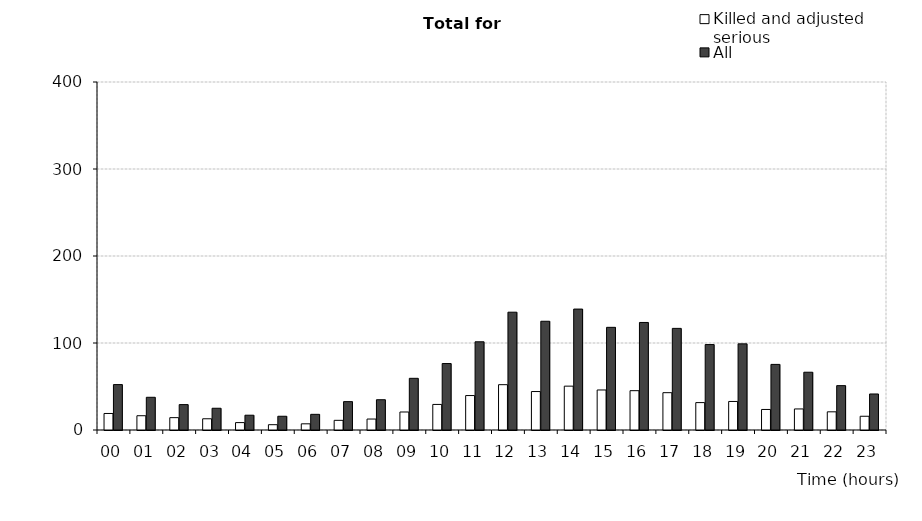
| Category | Killed and adjusted serious | All |
|---|---|---|
| 00 | 19 | 52.2 |
| 01 | 16.4 | 37.6 |
| 02 | 14.2 | 29.2 |
| 03 | 12.9 | 25 |
| 04 | 8.5 | 17 |
| 05 | 6.1 | 15.8 |
| 06 | 7.1 | 18 |
| 07 | 11.1 | 32.6 |
| 08 | 12.6 | 34.8 |
| 09 | 20.7 | 59.4 |
| 10 | 29.4 | 76.4 |
| 11 | 39.6 | 101.4 |
| 12 | 52.1 | 135.4 |
| 13 | 44.2 | 125 |
| 14 | 50.4 | 139 |
| 15 | 46 | 118 |
| 16 | 45.2 | 123.6 |
| 17 | 42.9 | 116.8 |
| 18 | 31.5 | 98.2 |
| 19 | 32.8 | 99 |
| 20 | 23.6 | 75.4 |
| 21 | 24.2 | 66.4 |
| 22 | 20.9 | 51 |
| 23 | 15.8 | 41.4 |